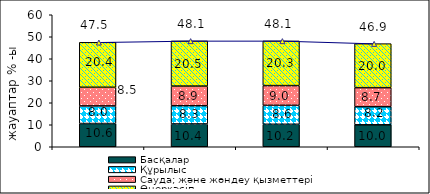
| Category | Басқалар | Құрылыс | Сауда; және жөндеу қызметтері | Өнеркәсіп |
|---|---|---|---|---|
| 0 | 10.566 | 7.987 | 8.491 | 20.44 |
| 1 | 10.364 | 8.291 | 8.92 | 20.54 |
| 2 | 10.217 | 8.607 | 8.978 | 20.31 |
| 3 | 9.976 | 8.233 | 8.654 | 20.012 |